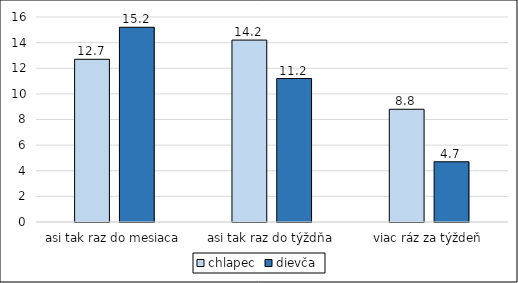
| Category | chlapec | dievča |
|---|---|---|
| asi tak raz do mesiaca | 12.7 | 15.2 |
| asi tak raz do týždňa | 14.2 | 11.2 |
| viac ráz za týždeň | 8.8 | 4.7 |